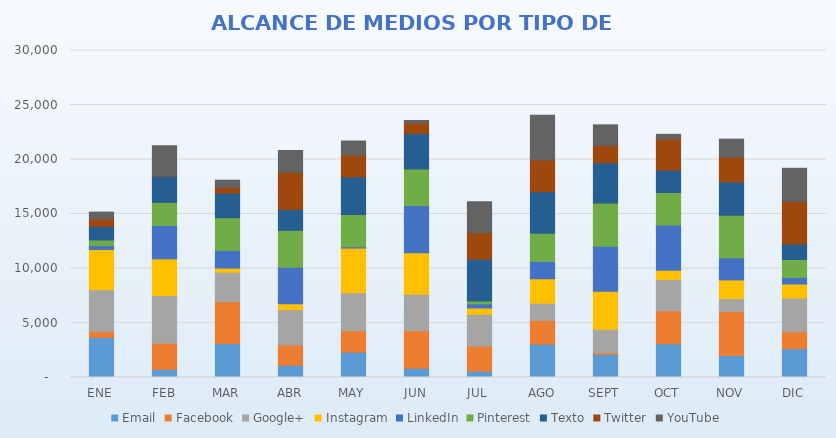
| Category | Email | Facebook | Google+ | Instagram | LinkedIn | Pinterest | Texto | Twitter | YouTube |
|---|---|---|---|---|---|---|---|---|---|
| ENE | 3675 | 534 | 3839 | 3694 | 357 | 516 | 1244 | 677 | 639 |
| FEB | 753 | 2387 | 4384 | 3360 | 3059 | 2122 | 2409 | 38 | 2750 |
| MAR | 3126 | 3839 | 2694 | 379 | 1625 | 2998 | 2259 | 509 | 672 |
| ABR | 1121 | 1860 | 3239 | 550 | 3345 | 3381 | 1918 | 3421 | 1993 |
| MAY | 2326 | 1953 | 3491 | 4107 | 112 | 2958 | 3455 | 2011 | 1281 |
| JUN | 842 | 3439 | 3346 | 3825 | 4338 | 3327 | 3258 | 976 | 226 |
| JUL | 578 | 2307 | 2914 | 581 | 383 | 257 | 3838 | 2435 | 2832 |
| AGO | 3060 | 2181 | 1571 | 2245 | 1591 | 2581 | 3819 | 2917 | 4100 |
| SEPT | 2118 | 155 | 2148 | 3496 | 4116 | 3967 | 3695 | 1590 | 1894 |
| OCT | 3106 | 3017 | 2876 | 830 | 4165 | 2981 | 2047 | 2875 | 410 |
| NOV | 2012 | 4035 | 1192 | 1714 | 2027 | 3910 | 3048 | 2282 | 1647 |
| DIC | 2644 | 1552 | 3097 | 1286 | 602 | 1643 | 1431 | 3900 | 3038 |